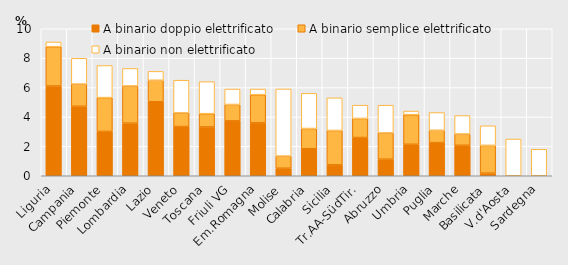
| Category | A binario doppio elettrificato | A binario semplice elettrificato | A binario non elettrificato |
|---|---|---|---|
| Liguria | 6.106 | 2.675 | 0.318 |
| Campania | 4.728 | 1.512 | 1.752 |
| Piemonte | 3.015 | 2.302 | 2.182 |
| Lombardia | 3.577 | 2.533 | 1.19 |
| Lazio | 5.034 | 1.463 | 0.604 |
| Veneto | 3.348 | 0.93 | 2.223 |
| Toscana | 3.322 | 0.902 | 2.176 |
| Friuli VG | 3.735 | 1.115 | 1.05 |
| Em.Romagna | 3.599 | 1.918 | 0.384 |
| Molise | 0.513 | 0.826 | 4.567 |
| Calabria | 1.837 | 1.378 | 2.391 |
| Sicilia | 0.742 | 2.337 | 2.221 |
| Tr.AA-SüdTir. | 2.602 | 1.296 | 0.902 |
| Abruzzo | 1.128 | 1.786 | 1.886 |
| Umbria | 2.143 | 2.011 | 0.246 |
| Puglia | 2.258 | 0.838 | 1.204 |
| Marche | 2.075 | 0.767 | 1.255 |
| Basilicata | 0.177 | 1.89 | 1.333 |
| V.d'Aosta | 0 | 0 | 2.5 |
| Sardegna | 0 | 0 | 1.8 |